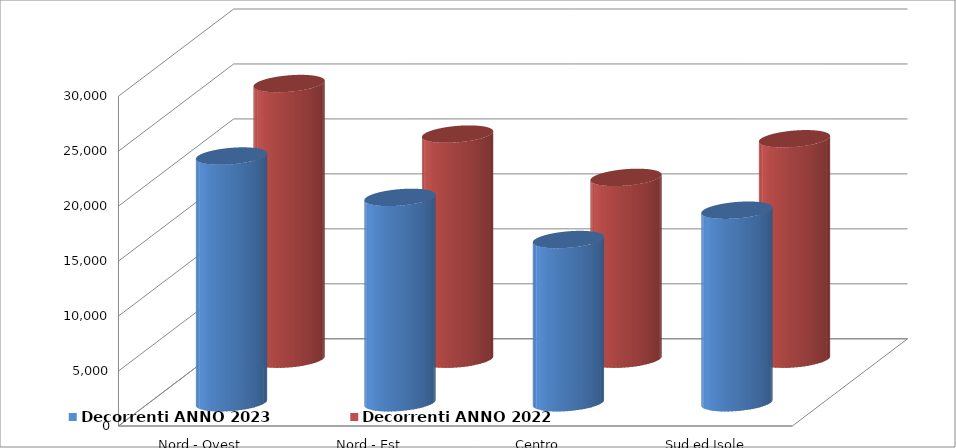
| Category | Decorrenti ANNO 2023 | Decorrenti ANNO 2022 |
|---|---|---|
| Nord - Ovest | 22447 | 25075 |
| Nord - Est | 18685 | 20476 |
| Centro | 14851 | 16538 |
| Sud ed Isole | 17520 | 20051 |